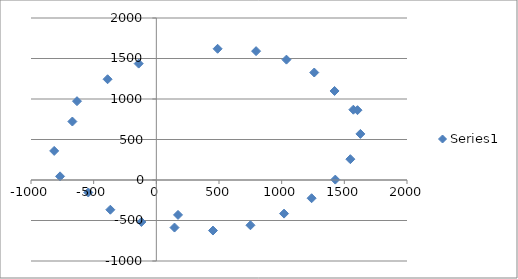
| Category | Series 0 |
|---|---|
| 1572.0 | 868 |
| 1422.0 | 1099 |
| 1260.0 | 1327 |
| 1038.0 | 1486 |
| 796.0 | 1591 |
| 489.0 | 1620 |
| 173.0 | -431 |
| -141.0 | 1437 |
| -389.0 | 1244 |
| -633.0 | 973 |
| -670.0 | 722 |
| -815.0 | 359 |
| -768.0 | 45 |
| -543.0 | -154 |
| -367.0 | -367 |
| -119.0 | -518 |
| 145.0 | -587 |
| 452.0 | -624 |
| 751.0 | -559 |
| 1019.0 | -415 |
| 1239.0 | -225 |
| 1428.0 | 5 |
| 1548.0 | 257 |
| 1628.0 | 569 |
| 1605.0 | 862 |